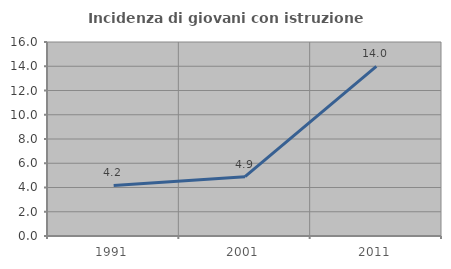
| Category | Incidenza di giovani con istruzione universitaria |
|---|---|
| 1991.0 | 4.167 |
| 2001.0 | 4.895 |
| 2011.0 | 13.983 |